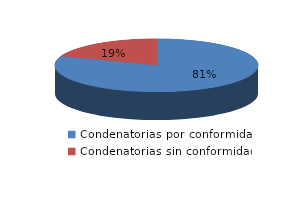
| Category | Series 0 |
|---|---|
| 0 | 515 |
| 1 | 124 |